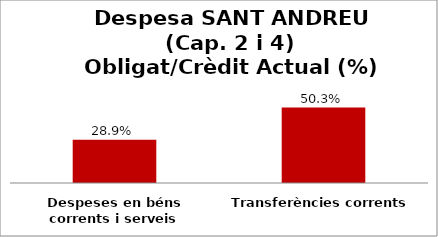
| Category | Series 0 |
|---|---|
| Despeses en béns corrents i serveis | 0.289 |
| Transferències corrents | 0.503 |